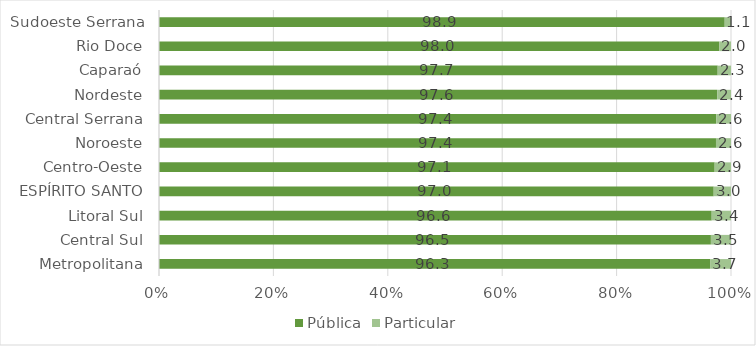
| Category | Pública | Particular |
|---|---|---|
| Metropolitana | 96.349 | 3.651 |
| Central Sul | 96.486 | 3.514 |
| Litoral Sul | 96.625 | 3.375 |
| ESPÍRITO SANTO | 96.977 | 3.023 |
| Centro-Oeste | 97.144 | 2.856 |
| Noroeste | 97.374 | 2.626 |
| Central Serrana | 97.414 | 2.586 |
| Nordeste | 97.58 | 2.42 |
| Caparaó | 97.674 | 2.326 |
| Rio Doce | 97.972 | 2.028 |
| Sudoeste Serrana | 98.902 | 1.098 |